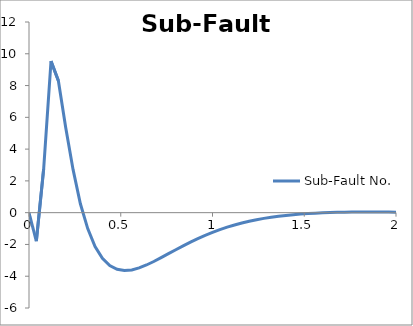
| Category | Sub-Fault No. |
|---|---|
| 0.0 | 0 |
| 0.04 | -1.797 |
| 0.08 | 2.771 |
| 0.12 | 9.537 |
| 0.16 | 8.306 |
| 0.2 | 5.354 |
| 0.24 | 2.724 |
| 0.28 | 0.559 |
| 0.32 | -1.001 |
| 0.36 | -2.128 |
| 0.4 | -2.865 |
| 0.44 | -3.329 |
| 0.48 | -3.565 |
| 0.52 | -3.646 |
| 0.56 | -3.602 |
| 0.6 | -3.478 |
| 0.64 | -3.293 |
| 0.68 | -3.073 |
| 0.72 | -2.831 |
| 0.76 | -2.582 |
| 0.8 | -2.33 |
| 0.84 | -2.087 |
| 0.88 | -1.853 |
| 0.92 | -1.633 |
| 0.96 | -1.428 |
| 1.0 | -1.24 |
| 1.04 | -1.068 |
| 1.08 | -0.913 |
| 1.12 | -0.774 |
| 1.16 | -0.65 |
| 1.2 | -0.541 |
| 1.24 | -0.444 |
| 1.28 | -0.36 |
| 1.32 | -0.287 |
| 1.36 | -0.225 |
| 1.4 | -0.171 |
| 1.44 | -0.126 |
| 1.48 | -0.088 |
| 1.52 | -0.056 |
| 1.56 | -0.03 |
| 1.6 | -0.01 |
| 1.64 | 0.007 |
| 1.68 | 0.019 |
| 1.72 | 0.028 |
| 1.76 | 0.034 |
| 1.8 | 0.038 |
| 1.84 | 0.04 |
| 1.88 | 0.04 |
| 1.92 | 0.038 |
| 1.96 | 0.035 |
| 2.0 | 0.031 |
| 2.04 | 0.026 |
| 2.08 | 0.021 |
| 2.12 | 0.015 |
| 2.16 | 0.009 |
| 2.2 | 0.002 |
| 2.24 | -0.005 |
| 2.28 | -0.012 |
| 2.32 | -0.019 |
| 2.36 | -0.026 |
| 2.4 | -0.033 |
| 2.44 | -0.04 |
| 2.48 | -0.047 |
| 2.52 | -0.054 |
| 2.56 | -0.06 |
| 2.6 | -0.067 |
| 2.64 | -0.073 |
| 2.68 | -0.079 |
| 2.72 | -0.085 |
| 2.76 | -0.09 |
| 2.8 | -0.096 |
| 2.84 | -0.101 |
| 2.88 | -0.106 |
| 2.92 | -0.11 |
| 2.96 | -0.115 |
| 3.0 | -0.119 |
| 3.04 | -0.124 |
| 3.08 | -0.128 |
| 3.12 | -0.131 |
| 3.16 | -0.135 |
| 3.2 | -0.138 |
| 3.24 | -0.142 |
| 3.28 | -0.145 |
| 3.32 | -0.148 |
| 3.36 | -0.151 |
| 3.4 | -0.153 |
| 3.44 | -0.156 |
| 3.48 | -0.158 |
| 3.52 | -0.161 |
| 3.56 | -0.163 |
| 3.6 | -0.165 |
| 3.64 | -0.167 |
| 3.68 | -0.169 |
| 3.72 | -0.171 |
| 3.76 | -0.172 |
| 3.8 | -0.174 |
| 3.84 | -0.175 |
| 3.88 | -0.177 |
| 3.92 | -0.178 |
| 3.96 | -0.18 |
| 4.0 | -0.181 |
| 4.04 | -0.182 |
| 4.08 | -0.183 |
| 4.12 | -0.184 |
| 4.16 | -0.185 |
| 4.2 | -0.186 |
| 4.24 | -0.187 |
| 4.28 | -0.188 |
| 4.32 | -0.188 |
| 4.36 | -0.189 |
| 4.4 | -0.19 |
| 4.44 | -0.191 |
| 4.48 | -0.191 |
| 4.52 | -0.192 |
| 4.56 | -0.192 |
| 4.6 | -0.193 |
| 4.64 | -0.193 |
| 4.68 | -0.194 |
| 4.72 | -0.194 |
| 4.76 | -0.194 |
| 4.8 | -0.194 |
| 4.84 | -0.194 |
| 4.88 | -0.194 |
| 4.92 | -0.194 |
| 4.96 | -0.194 |
| 5.0 | -0.194 |
| 5.04 | -0.194 |
| 5.08 | -0.194 |
| 5.12 | -0.194 |
| 5.16 | -0.194 |
| 5.2 | -0.194 |
| 5.24 | -0.194 |
| 5.28 | -0.194 |
| 5.32 | -0.194 |
| 5.36 | -0.194 |
| 5.4 | -0.194 |
| 5.44 | -0.194 |
| 5.48 | -0.194 |
| 5.52 | -0.194 |
| 5.56 | -0.194 |
| 5.6 | -0.194 |
| 5.64 | -0.194 |
| 5.68 | -0.194 |
| 5.72 | -0.194 |
| 5.76 | -0.194 |
| 5.8 | -0.194 |
| 5.84 | -0.194 |
| 5.88 | -0.194 |
| 5.92 | -0.194 |
| 5.96 | -0.194 |
| 6.0 | -0.194 |
| 6.04 | -0.194 |
| 6.08 | -0.194 |
| 6.12 | -0.194 |
| 6.16 | -0.194 |
| 6.2 | -0.194 |
| 6.24 | -0.194 |
| 6.28 | -0.194 |
| 6.32 | -0.194 |
| 6.36 | -0.194 |
| 6.4 | -0.194 |
| 6.44 | -0.194 |
| 6.48 | -0.194 |
| 6.52 | -0.194 |
| 6.56 | -0.194 |
| 6.6 | -0.194 |
| 6.64 | -0.194 |
| 6.68 | -0.194 |
| 6.72 | -0.194 |
| 6.76 | -0.194 |
| 6.8 | -0.194 |
| 6.84 | -0.194 |
| 6.88 | -0.194 |
| 6.92 | -0.194 |
| 6.96 | -0.194 |
| 7.0 | -0.194 |
| 7.04 | -0.194 |
| 7.08 | -0.194 |
| 7.12 | -0.194 |
| 7.16 | -0.194 |
| 7.2 | -0.194 |
| 7.24 | -0.194 |
| 7.28 | -0.194 |
| 7.32 | -0.194 |
| 7.36 | -0.194 |
| 7.4 | -0.194 |
| 7.44 | -0.194 |
| 7.48 | -0.194 |
| 7.52 | -0.194 |
| 7.56 | -0.194 |
| 7.6 | -0.194 |
| 7.64 | -0.194 |
| 7.68 | -0.194 |
| 7.72 | -0.194 |
| 7.76 | -0.194 |
| 7.8 | -0.194 |
| 7.84 | -0.194 |
| 7.88 | -0.194 |
| 7.92 | -0.194 |
| 7.96 | -0.194 |
| 8.0 | -0.194 |
| 8.04 | -0.194 |
| 8.08 | -0.194 |
| 8.12 | -0.194 |
| 8.16 | -0.194 |
| 8.2 | -0.194 |
| 8.24 | -0.194 |
| 8.28 | -0.194 |
| 8.32 | -0.194 |
| 8.36 | -0.194 |
| 8.4 | -0.194 |
| 8.44 | -0.194 |
| 8.48 | -0.194 |
| 8.52 | -0.194 |
| 8.56 | -0.194 |
| 8.6 | -0.194 |
| 8.64 | -0.194 |
| 8.68 | -0.194 |
| 8.72 | -0.194 |
| 8.76 | -0.194 |
| 8.8 | -0.194 |
| 8.84 | -0.194 |
| 8.88 | -0.194 |
| 8.92 | -0.194 |
| 8.96 | -0.194 |
| 9.0 | -0.194 |
| 9.04 | -0.194 |
| 9.08 | -0.194 |
| 9.12 | -0.194 |
| 9.16 | -0.194 |
| 9.2 | -0.194 |
| 9.24 | -0.194 |
| 9.28 | -0.194 |
| 9.32 | -0.194 |
| 9.36 | -0.194 |
| 9.4 | -0.194 |
| 9.44 | -0.194 |
| 9.48 | -0.194 |
| 9.52 | -0.194 |
| 9.56 | -0.194 |
| 9.6 | -0.194 |
| 9.64 | -0.194 |
| 9.68 | -0.194 |
| 9.72 | -0.194 |
| 9.76 | -0.194 |
| 9.8 | -0.194 |
| 9.84 | -0.194 |
| 9.88 | -0.194 |
| 9.92 | -0.194 |
| 9.96 | -0.194 |
| 10.0 | -0.194 |
| 10.04 | -0.194 |
| 10.08 | -0.194 |
| 10.12 | -0.194 |
| 10.16 | -0.194 |
| 10.2 | -0.194 |
| 10.24 | -0.194 |
| 10.28 | -0.194 |
| 10.32 | -0.194 |
| 10.36 | -0.194 |
| 10.4 | -0.194 |
| 10.44 | -0.194 |
| 10.48 | -0.194 |
| 10.52 | -0.194 |
| 10.56 | -0.194 |
| 10.6 | -0.194 |
| 10.64 | -0.194 |
| 10.68 | -0.194 |
| 10.72 | -0.194 |
| 10.76 | -0.194 |
| 10.8 | -0.194 |
| 10.84 | -0.194 |
| 10.88 | -0.194 |
| 10.92 | -0.194 |
| 10.96 | -0.194 |
| 11.0 | -0.194 |
| 11.04 | -0.194 |
| 11.08 | -0.194 |
| 11.12 | -0.194 |
| 11.16 | -0.194 |
| 11.2 | -0.194 |
| 11.24 | -0.194 |
| 11.28 | -0.194 |
| 11.32 | -0.194 |
| 11.36 | -0.194 |
| 11.4 | -0.194 |
| 11.44 | -0.194 |
| 11.48 | -0.194 |
| 11.52 | -0.194 |
| 11.56 | -0.194 |
| 11.6 | -0.194 |
| 11.64 | -0.194 |
| 11.68 | -0.194 |
| 11.72 | -0.194 |
| 11.76 | -0.194 |
| 11.8 | -0.194 |
| 11.84 | -0.194 |
| 11.88 | -0.194 |
| 11.92 | -0.194 |
| 11.96 | -0.194 |
| 12.0 | -0.194 |
| 12.04 | -0.194 |
| 12.08 | -0.194 |
| 12.12 | -0.194 |
| 12.16 | -0.194 |
| 12.2 | -0.194 |
| 12.24 | -0.194 |
| 12.28 | -0.194 |
| 12.32 | -0.194 |
| 12.36 | -0.194 |
| 12.4 | -0.194 |
| 12.44 | -0.194 |
| 12.48 | -0.194 |
| 12.52 | -0.194 |
| 12.56 | -0.194 |
| 12.6 | -0.194 |
| 12.64 | -0.194 |
| 12.68 | -0.194 |
| 12.72 | -0.194 |
| 12.76 | -0.194 |
| 12.8 | -0.194 |
| 12.84 | -0.194 |
| 12.88 | -0.194 |
| 12.92 | -0.194 |
| 12.96 | -0.194 |
| 13.0 | -0.194 |
| 13.04 | -0.194 |
| 13.08 | -0.194 |
| 13.12 | -0.194 |
| 13.16 | -0.194 |
| 13.2 | -0.194 |
| 13.24 | -0.194 |
| 13.28 | -0.194 |
| 13.32 | -0.194 |
| 13.36 | -0.194 |
| 13.4 | -0.194 |
| 13.44 | -0.194 |
| 13.48 | -0.194 |
| 13.52 | -0.194 |
| 13.56 | -0.194 |
| 13.6 | -0.194 |
| 13.64 | -0.194 |
| 13.68 | -0.194 |
| 13.72 | -0.194 |
| 13.76 | -0.194 |
| 13.8 | -0.194 |
| 13.84 | -0.194 |
| 13.88 | -0.194 |
| 13.92 | -0.194 |
| 13.96 | -0.194 |
| 14.0 | -0.194 |
| 14.04 | -0.194 |
| 14.08 | -0.194 |
| 14.12 | -0.194 |
| 14.16 | -0.194 |
| 14.2 | -0.194 |
| 14.24 | -0.194 |
| 14.28 | -0.194 |
| 14.32 | -0.194 |
| 14.36 | -0.194 |
| 14.4 | -0.194 |
| 14.44 | -0.194 |
| 14.48 | -0.194 |
| 14.52 | -0.194 |
| 14.56 | -0.194 |
| 14.6 | -0.194 |
| 14.64 | -0.194 |
| 14.68 | -0.194 |
| 14.72 | -0.194 |
| 14.76 | -0.194 |
| 14.8 | -0.194 |
| 14.84 | -0.194 |
| 14.88 | -0.194 |
| 14.92 | -0.194 |
| 14.96 | -0.194 |
| 15.0 | -0.194 |
| 15.04 | -0.194 |
| 15.08 | -0.194 |
| 15.12 | -0.194 |
| 15.16 | -0.194 |
| 15.2 | -0.194 |
| 15.24 | -0.194 |
| 15.28 | -0.194 |
| 15.32 | -0.194 |
| 15.36 | -0.194 |
| 15.4 | -0.194 |
| 15.44 | -0.194 |
| 15.48 | -0.194 |
| 15.52 | -0.194 |
| 15.56 | -0.194 |
| 15.6 | -0.194 |
| 15.64 | -0.194 |
| 15.68 | -0.194 |
| 15.72 | -0.194 |
| 15.76 | -0.194 |
| 15.8 | -0.194 |
| 15.84 | -0.194 |
| 15.88 | -0.194 |
| 15.92 | -0.194 |
| 15.96 | -0.194 |
| 16.0 | -0.194 |
| 16.04 | -0.194 |
| 16.08 | -0.194 |
| 16.12 | -0.194 |
| 16.16 | -0.194 |
| 16.2 | -0.194 |
| 16.24 | -0.194 |
| 16.28 | -0.194 |
| 16.32 | -0.194 |
| 16.36 | -0.194 |
| 16.4 | -0.194 |
| 16.44 | -0.194 |
| 16.48 | -0.194 |
| 16.52 | -0.194 |
| 16.56 | -0.194 |
| 16.6 | -0.194 |
| 16.64 | -0.194 |
| 16.68 | -0.194 |
| 16.72 | -0.194 |
| 16.76 | -0.194 |
| 16.8 | -0.194 |
| 16.84 | -0.194 |
| 16.88 | -0.194 |
| 16.92 | -0.194 |
| 16.96 | -0.194 |
| 17.0 | -0.194 |
| 17.04 | -0.194 |
| 17.08 | -0.194 |
| 17.12 | -0.194 |
| 17.16 | -0.194 |
| 17.2 | -0.194 |
| 17.24 | -0.194 |
| 17.28 | -0.194 |
| 17.32 | -0.194 |
| 17.36 | -0.194 |
| 17.4 | -0.194 |
| 17.44 | -0.194 |
| 17.48 | -0.194 |
| 17.52 | -0.194 |
| 17.56 | -0.194 |
| 17.6 | -0.194 |
| 17.64 | -0.194 |
| 17.68 | -0.194 |
| 17.72 | -0.194 |
| 17.76 | -0.194 |
| 17.8 | -0.194 |
| 17.84 | -0.194 |
| 17.88 | -0.194 |
| 17.92 | -0.194 |
| 17.96 | -0.194 |
| 18.0 | -0.194 |
| 18.04 | -0.194 |
| 18.08 | -0.194 |
| 18.12 | -0.194 |
| 18.16 | -0.194 |
| 18.2 | -0.194 |
| 18.24 | -0.194 |
| 18.28 | -0.194 |
| 18.32 | -0.194 |
| 18.36 | -0.194 |
| 18.4 | -0.194 |
| 18.44 | -0.194 |
| 18.48 | -0.194 |
| 18.52 | -0.194 |
| 18.56 | -0.194 |
| 18.6 | -0.194 |
| 18.64 | -0.194 |
| 18.68 | -0.194 |
| 18.72 | -0.194 |
| 18.76 | -0.194 |
| 18.8 | -0.194 |
| 18.84 | -0.194 |
| 18.88 | -0.194 |
| 18.92 | -0.194 |
| 18.96 | -0.194 |
| 19.0 | -0.194 |
| 19.04 | -0.194 |
| 19.08 | -0.194 |
| 19.12 | -0.194 |
| 19.16 | -0.194 |
| 19.2 | -0.194 |
| 19.24 | -0.194 |
| 19.28 | -0.194 |
| 19.32 | -0.194 |
| 19.36 | -0.194 |
| 19.4 | -0.194 |
| 19.44 | -0.194 |
| 19.48 | -0.194 |
| 19.52 | -0.194 |
| 19.56 | -0.194 |
| 19.6 | -0.194 |
| 19.64 | -0.194 |
| 19.68 | -0.194 |
| 19.72 | -0.194 |
| 19.76 | -0.194 |
| 19.8 | -0.194 |
| 19.84 | -0.194 |
| 19.88 | -0.194 |
| 19.92 | -0.194 |
| 19.96 | -0.194 |
| 20.0 | -0.194 |
| 20.04 | -0.194 |
| 20.08 | -0.194 |
| 20.12 | -0.194 |
| 20.16 | -0.194 |
| 20.2 | -0.194 |
| 20.24 | -0.194 |
| 20.28 | -0.194 |
| 20.32 | -0.194 |
| 20.36 | -0.194 |
| 20.4 | -0.194 |
| 20.44 | -0.194 |
| 20.48 | -0.194 |
| 20.52 | -0.194 |
| 20.56 | -0.194 |
| 20.6 | -0.194 |
| 20.64 | -0.194 |
| 20.68 | -0.194 |
| 20.72 | -0.194 |
| 20.76 | -0.194 |
| 20.8 | -0.194 |
| 20.84 | -0.194 |
| 20.88 | -0.194 |
| 20.92 | -0.194 |
| 20.96 | -0.194 |
| 21.0 | -0.194 |
| 21.04 | -0.194 |
| 21.08 | -0.194 |
| 21.12 | -0.194 |
| 21.16 | -0.194 |
| 21.2 | -0.194 |
| 21.24 | -0.194 |
| 21.28 | -0.194 |
| 21.32 | -0.194 |
| 21.36 | -0.194 |
| 21.4 | -0.194 |
| 21.44 | -0.194 |
| 21.48 | -0.194 |
| 21.52 | -0.194 |
| 21.56 | -0.194 |
| 21.6 | -0.194 |
| 21.64 | -0.194 |
| 21.68 | -0.194 |
| 21.72 | -0.194 |
| 21.76 | -0.194 |
| 21.8 | -0.194 |
| 21.84 | -0.194 |
| 21.88 | -0.194 |
| 21.92 | -0.194 |
| 21.96 | -0.194 |
| 22.0 | -0.194 |
| 22.04 | -0.194 |
| 22.08 | -0.194 |
| 22.12 | -0.194 |
| 22.16 | -0.194 |
| 22.2 | -0.194 |
| 22.24 | -0.194 |
| 22.28 | -0.194 |
| 22.32 | -0.194 |
| 22.36 | -0.194 |
| 22.4 | -0.194 |
| 22.44 | -0.194 |
| 22.48 | -0.194 |
| 22.52 | -0.194 |
| 22.56 | -0.194 |
| 22.6 | -0.194 |
| 22.64 | -0.194 |
| 22.68 | -0.194 |
| 22.72 | -0.194 |
| 22.76 | -0.194 |
| 22.8 | -0.194 |
| 22.84 | -0.194 |
| 22.88 | -0.194 |
| 22.92 | -0.194 |
| 22.96 | -0.194 |
| 23.0 | -0.194 |
| 23.04 | -0.194 |
| 23.08 | -0.194 |
| 23.12 | -0.194 |
| 23.16 | -0.194 |
| 23.2 | -0.194 |
| 23.24 | -0.194 |
| 23.28 | -0.194 |
| 23.32 | -0.194 |
| 23.36 | -0.194 |
| 23.4 | -0.194 |
| 23.44 | -0.194 |
| 23.48 | -0.194 |
| 23.52 | -0.194 |
| 23.56 | -0.194 |
| 23.6 | -0.194 |
| 23.64 | -0.194 |
| 23.68 | -0.194 |
| 23.72 | -0.194 |
| 23.76 | -0.194 |
| 23.8 | -0.194 |
| 23.84 | -0.194 |
| 23.88 | -0.194 |
| 23.92 | -0.194 |
| 23.96 | -0.194 |
| 24.0 | -0.194 |
| 24.04 | -0.194 |
| 24.08 | -0.194 |
| 24.12 | -0.194 |
| 24.16 | -0.194 |
| 24.2 | -0.194 |
| 24.24 | -0.194 |
| 24.28 | -0.194 |
| 24.32 | -0.194 |
| 24.36 | -0.194 |
| 24.4 | -0.194 |
| 24.44 | -0.194 |
| 24.48 | -0.194 |
| 24.52 | -0.194 |
| 24.56 | -0.194 |
| 24.6 | -0.194 |
| 24.64 | -0.194 |
| 24.68 | -0.194 |
| 24.72 | -0.194 |
| 24.76 | -0.194 |
| 24.8 | -0.194 |
| 24.84 | -0.194 |
| 24.88 | -0.194 |
| 24.92 | -0.194 |
| 24.96 | -0.194 |
| 25.0 | -0.194 |
| 25.04 | -0.194 |
| 25.08 | -0.194 |
| 25.12 | -0.194 |
| 25.16 | -0.194 |
| 25.2 | -0.194 |
| 25.24 | -0.194 |
| 25.28 | -0.194 |
| 25.32 | -0.194 |
| 25.36 | -0.194 |
| 25.4 | -0.194 |
| 25.44 | -0.194 |
| 25.48 | -0.194 |
| 25.52 | -0.194 |
| 25.56 | -0.194 |
| 25.6 | -0.194 |
| 25.64 | -0.194 |
| 25.68 | -0.194 |
| 25.72 | -0.194 |
| 25.76 | -0.194 |
| 25.8 | -0.194 |
| 25.84 | -0.194 |
| 25.88 | -0.194 |
| 25.92 | -0.194 |
| 25.96 | -0.194 |
| 26.0 | -0.194 |
| 26.04 | -0.194 |
| 26.08 | -0.194 |
| 26.12 | -0.194 |
| 26.16 | -0.194 |
| 26.2 | -0.194 |
| 26.24 | -0.194 |
| 26.28 | -0.194 |
| 26.32 | -0.194 |
| 26.36 | -0.194 |
| 26.4 | -0.194 |
| 26.44 | -0.194 |
| 26.48 | -0.194 |
| 26.52 | -0.194 |
| 26.56 | -0.194 |
| 26.6 | -0.194 |
| 26.64 | -0.194 |
| 26.68 | -0.194 |
| 26.72 | -0.194 |
| 26.76 | -0.194 |
| 26.8 | -0.194 |
| 26.84 | -0.194 |
| 26.88 | -0.194 |
| 26.92 | -0.194 |
| 26.96 | -0.194 |
| 27.0 | -0.194 |
| 27.04 | -0.194 |
| 27.08 | -0.194 |
| 27.12 | -0.194 |
| 27.16 | -0.194 |
| 27.2 | -0.194 |
| 27.24 | -0.194 |
| 27.28 | -0.194 |
| 27.32 | -0.194 |
| 27.36 | -0.194 |
| 27.4 | -0.194 |
| 27.44 | -0.194 |
| 27.48 | -0.194 |
| 27.52 | -0.194 |
| 27.56 | -0.194 |
| 27.6 | -0.194 |
| 27.64 | -0.194 |
| 27.68 | -0.194 |
| 27.72 | -0.194 |
| 27.76 | -0.194 |
| 27.8 | -0.194 |
| 27.84 | -0.194 |
| 27.88 | -0.194 |
| 27.92 | -0.194 |
| 27.96 | -0.194 |
| 28.0 | -0.194 |
| 28.04 | -0.194 |
| 28.08 | -0.194 |
| 28.12 | -0.194 |
| 28.16 | -0.194 |
| 28.2 | -0.194 |
| 28.24 | -0.194 |
| 28.28 | -0.194 |
| 28.32 | -0.194 |
| 28.36 | -0.194 |
| 28.4 | -0.194 |
| 28.44 | -0.194 |
| 28.48 | -0.194 |
| 28.52 | -0.194 |
| 28.56 | -0.194 |
| 28.6 | -0.194 |
| 28.64 | -0.194 |
| 28.68 | -0.194 |
| 28.72 | -0.194 |
| 28.76 | -0.194 |
| 28.8 | -0.194 |
| 28.84 | -0.194 |
| 28.88 | -0.194 |
| 28.92 | -0.194 |
| 28.96 | -0.194 |
| 29.0 | -0.194 |
| 29.04 | -0.194 |
| 29.08 | -0.194 |
| 29.12 | -0.194 |
| 29.16 | -0.194 |
| 29.2 | -0.194 |
| 29.24 | -0.194 |
| 29.28 | -0.194 |
| 29.32 | -0.194 |
| 29.36 | -0.194 |
| 29.4 | -0.194 |
| 29.44 | -0.194 |
| 29.48 | -0.194 |
| 29.52 | -0.194 |
| 29.56 | -0.194 |
| 29.6 | -0.194 |
| 29.64 | -0.194 |
| 29.68 | -0.194 |
| 29.72 | -0.194 |
| 29.76 | -0.194 |
| 29.8 | -0.194 |
| 29.84 | -0.194 |
| 29.88 | -0.194 |
| 29.92 | -0.194 |
| 29.96 | -0.194 |
| 30.0 | -0.194 |
| 30.04 | -0.194 |
| 30.08 | -0.194 |
| 30.12 | -0.194 |
| 30.16 | -0.194 |
| 30.2 | -0.194 |
| 30.24 | -0.194 |
| 30.28 | -0.194 |
| 30.32 | -0.194 |
| 30.36 | -0.194 |
| 30.4 | -0.194 |
| 30.44 | -0.194 |
| 30.48 | -0.194 |
| 30.52 | -0.194 |
| 30.56 | -0.194 |
| 30.6 | -0.194 |
| 30.64 | -0.194 |
| 30.68 | -0.194 |
| 30.72 | -0.194 |
| 30.76 | -0.194 |
| 30.8 | -0.194 |
| 30.84 | -0.194 |
| 30.88 | -0.194 |
| 30.92 | -0.194 |
| 30.96 | -0.194 |
| 31.0 | -0.194 |
| 31.04 | -0.194 |
| 31.08 | -0.194 |
| 31.12 | -0.194 |
| 31.16 | -0.194 |
| 31.2 | -0.194 |
| 31.24 | -0.194 |
| 31.28 | -0.194 |
| 31.32 | -0.194 |
| 31.36 | -0.194 |
| 31.4 | -0.194 |
| 31.44 | -0.194 |
| 31.48 | -0.194 |
| 31.52 | -0.194 |
| 31.56 | -0.194 |
| 31.6 | -0.194 |
| 31.64 | -0.194 |
| 31.68 | -0.194 |
| 31.72 | -0.194 |
| 31.76 | -0.194 |
| 31.8 | -0.194 |
| 31.84 | -0.194 |
| 31.88 | -0.194 |
| 31.92 | -0.194 |
| 31.96 | -0.194 |
| 32.0 | -0.194 |
| 32.04 | -0.194 |
| 32.08 | -0.194 |
| 32.12 | -0.194 |
| 32.16 | -0.194 |
| 32.2 | -0.194 |
| 32.24 | -0.194 |
| 32.28 | -0.194 |
| 32.32 | -0.194 |
| 32.36 | -0.194 |
| 32.4 | -0.194 |
| 32.44 | -0.194 |
| 32.48 | -0.194 |
| 32.52 | -0.194 |
| 32.56 | -0.194 |
| 32.6 | -0.194 |
| 32.64 | -0.194 |
| 32.68 | -0.194 |
| 32.72 | -0.194 |
| 32.76 | -0.194 |
| 32.8 | -0.194 |
| 32.84 | -0.194 |
| 32.88 | -0.194 |
| 32.92 | -0.194 |
| 32.96 | -0.194 |
| 33.0 | -0.194 |
| 33.04 | -0.194 |
| 33.08 | -0.194 |
| 33.12 | -0.194 |
| 33.16 | -0.194 |
| 33.2 | -0.194 |
| 33.24 | -0.194 |
| 33.28 | -0.194 |
| 33.32 | -0.194 |
| 33.36 | -0.194 |
| 33.4 | -0.194 |
| 33.44 | -0.194 |
| 33.48 | -0.194 |
| 33.52 | -0.194 |
| 33.56 | -0.194 |
| 33.6 | -0.194 |
| 33.64 | -0.194 |
| 33.68 | -0.194 |
| 33.72 | -0.194 |
| 33.76 | -0.194 |
| 33.8 | -0.194 |
| 33.84 | -0.194 |
| 33.88 | -0.194 |
| 33.92 | -0.194 |
| 33.96 | -0.194 |
| 34.0 | -0.194 |
| 34.04 | -0.194 |
| 34.08 | -0.194 |
| 34.12 | -0.194 |
| 34.16 | -0.194 |
| 34.2 | -0.194 |
| 34.24 | -0.194 |
| 34.28 | -0.194 |
| 34.32 | -0.194 |
| 34.36 | -0.194 |
| 34.4 | -0.194 |
| 34.44 | -0.194 |
| 34.48 | -0.194 |
| 34.52 | -0.194 |
| 34.56 | -0.194 |
| 34.6 | -0.194 |
| 34.64 | -0.194 |
| 34.68 | -0.194 |
| 34.72 | -0.194 |
| 34.76 | -0.194 |
| 34.8 | -0.194 |
| 34.84 | -0.194 |
| 34.88 | -0.194 |
| 34.92 | -0.194 |
| 34.96 | -0.194 |
| 35.0 | -0.194 |
| 35.04 | -0.194 |
| 35.08 | -0.194 |
| 35.12 | -0.194 |
| 35.16 | -0.194 |
| 35.2 | -0.194 |
| 35.24 | -0.194 |
| 35.28 | -0.194 |
| 35.32 | -0.194 |
| 35.36 | -0.194 |
| 35.4 | -0.194 |
| 35.44 | -0.194 |
| 35.48 | -0.194 |
| 35.52 | -0.194 |
| 35.56 | -0.194 |
| 35.6 | -0.194 |
| 35.64 | -0.194 |
| 35.68 | -0.194 |
| 35.72 | -0.194 |
| 35.76 | -0.194 |
| 35.8 | -0.194 |
| 35.84 | -0.194 |
| 35.88 | -0.194 |
| 35.92 | -0.194 |
| 35.96 | -0.194 |
| 36.0 | -0.194 |
| 36.04 | -0.194 |
| 36.08 | -0.194 |
| 36.12 | -0.194 |
| 36.16 | -0.194 |
| 36.2 | -0.194 |
| 36.24 | -0.194 |
| 36.28 | -0.194 |
| 36.32 | -0.194 |
| 36.36 | -0.194 |
| 36.4 | -0.194 |
| 36.44 | -0.194 |
| 36.48 | -0.194 |
| 36.52 | -0.194 |
| 36.56 | -0.194 |
| 36.6 | -0.194 |
| 36.64 | -0.194 |
| 36.68 | -0.194 |
| 36.72 | -0.194 |
| 36.76 | -0.194 |
| 36.8 | -0.194 |
| 36.84 | -0.194 |
| 36.88 | -0.194 |
| 36.92 | -0.194 |
| 36.96 | -0.194 |
| 37.0 | -0.194 |
| 37.04 | -0.194 |
| 37.08 | -0.194 |
| 37.12 | -0.194 |
| 37.16 | -0.194 |
| 37.2 | -0.194 |
| 37.24 | -0.194 |
| 37.28 | -0.194 |
| 37.32 | -0.194 |
| 37.36 | -0.194 |
| 37.4 | -0.194 |
| 37.44 | -0.194 |
| 37.48 | -0.194 |
| 37.52 | -0.194 |
| 37.56 | -0.194 |
| 37.6 | -0.194 |
| 37.64 | -0.194 |
| 37.68 | -0.194 |
| 37.72 | -0.194 |
| 37.76 | -0.194 |
| 37.8 | -0.194 |
| 37.84 | -0.194 |
| 37.88 | -0.194 |
| 37.92 | -0.194 |
| 37.96 | -0.194 |
| 38.0 | -0.194 |
| 38.04 | -0.194 |
| 38.08 | -0.194 |
| 38.12 | -0.194 |
| 38.16 | -0.194 |
| 38.2 | -0.194 |
| 38.24 | -0.194 |
| 38.28 | -0.194 |
| 38.32 | -0.194 |
| 38.36 | -0.194 |
| 38.4 | -0.194 |
| 38.44 | -0.194 |
| 38.48 | -0.194 |
| 38.52 | -0.194 |
| 38.56 | -0.194 |
| 38.6 | -0.194 |
| 38.64 | -0.194 |
| 38.68 | -0.194 |
| 38.72 | -0.194 |
| 38.76 | -0.194 |
| 38.8 | -0.194 |
| 38.84 | -0.194 |
| 38.88 | -0.194 |
| 38.92 | -0.194 |
| 38.96 | -0.194 |
| 39.0 | -0.194 |
| 39.04 | -0.194 |
| 39.08 | -0.194 |
| 39.12 | -0.194 |
| 39.16 | -0.194 |
| 39.2 | -0.194 |
| 39.24 | -0.194 |
| 39.28 | -0.194 |
| 39.32 | -0.194 |
| 39.36 | -0.194 |
| 39.4 | -0.194 |
| 39.44 | -0.194 |
| 39.48 | -0.194 |
| 39.52 | -0.194 |
| 39.56 | -0.194 |
| 39.6 | -0.194 |
| 39.64 | -0.194 |
| 39.68 | -0.194 |
| 39.72 | -0.194 |
| 39.76 | -0.194 |
| 39.8 | -0.194 |
| 39.84 | -0.194 |
| 39.88 | -0.194 |
| 39.92 | -0.194 |
| 39.96 | -0.194 |
| 40.0 | -0.194 |
| 40.04 | -0.194 |
| 40.08 | -0.194 |
| 40.12 | -0.194 |
| 40.16 | -0.194 |
| 40.2 | -0.194 |
| 40.24 | -0.194 |
| 40.28 | -0.194 |
| 40.32 | -0.194 |
| 40.36 | -0.194 |
| 40.4 | -0.194 |
| 40.44 | -0.194 |
| 40.48 | -0.194 |
| 40.52 | -0.194 |
| 40.56 | -0.194 |
| 40.6 | -0.194 |
| 40.64 | -0.194 |
| 40.68 | -0.194 |
| 40.72 | -0.194 |
| 40.76 | -0.194 |
| 40.8 | -0.194 |
| 40.84 | -0.194 |
| 40.88 | -0.194 |
| 40.92 | -0.194 |
| 40.96 | -0.194 |
| 41.0 | -0.194 |
| 41.04 | -0.194 |
| 41.08 | -0.194 |
| 41.12 | -0.194 |
| 41.16 | -0.194 |
| 41.2 | -0.194 |
| 41.24 | -0.194 |
| 41.28 | -0.194 |
| 41.32 | -0.194 |
| 41.36 | -0.194 |
| 41.4 | -0.194 |
| 41.44 | -0.194 |
| 41.48 | -0.194 |
| 41.52 | -0.194 |
| 41.56 | -0.194 |
| 41.6 | -0.194 |
| 41.64 | -0.194 |
| 41.68 | -0.194 |
| 41.72 | -0.194 |
| 41.76 | -0.194 |
| 41.8 | -0.194 |
| 41.84 | -0.194 |
| 41.88 | -0.194 |
| 41.92 | -0.194 |
| 41.96 | -0.194 |
| 42.0 | -0.194 |
| 42.04 | -0.194 |
| 42.08 | -0.194 |
| 42.12 | -0.194 |
| 42.16 | -0.194 |
| 42.2 | -0.194 |
| 42.24 | -0.194 |
| 42.28 | -0.194 |
| 42.32 | -0.194 |
| 42.36 | -0.194 |
| 42.4 | -0.194 |
| 42.44 | -0.194 |
| 42.48 | -0.194 |
| 42.52 | -0.194 |
| 42.56 | -0.194 |
| 42.6 | -0.194 |
| 42.64 | -0.194 |
| 42.68 | -0.194 |
| 42.72 | -0.194 |
| 42.76 | -0.194 |
| 42.8 | -0.194 |
| 42.84 | -0.194 |
| 42.88 | -0.194 |
| 42.92 | -0.194 |
| 42.96 | -0.194 |
| 43.0 | -0.194 |
| 43.04 | -0.194 |
| 43.08 | -0.194 |
| 43.12 | -0.194 |
| 43.16 | -0.194 |
| 43.2 | -0.194 |
| 43.24 | -0.194 |
| 43.28 | -0.194 |
| 43.32 | -0.194 |
| 43.36 | -0.194 |
| 43.4 | -0.194 |
| 43.44 | -0.194 |
| 43.48 | -0.194 |
| 43.52 | -0.194 |
| 43.56 | -0.194 |
| 43.6 | -0.194 |
| 43.64 | -0.194 |
| 43.68 | -0.194 |
| 43.72 | -0.194 |
| 43.76 | -0.194 |
| 43.8 | -0.194 |
| 43.84 | -0.194 |
| 43.88 | -0.194 |
| 43.92 | -0.194 |
| 43.96 | -0.194 |
| 44.0 | -0.194 |
| 44.04 | -0.194 |
| 44.08 | -0.194 |
| 44.12 | -0.194 |
| 44.16 | -0.194 |
| 44.2 | -0.194 |
| 44.24 | -0.194 |
| 44.28 | -0.194 |
| 44.32 | -0.194 |
| 44.36 | -0.194 |
| 44.4 | -0.194 |
| 44.44 | -0.194 |
| 44.48 | -0.194 |
| 44.52 | -0.194 |
| 44.56 | -0.194 |
| 44.6 | -0.194 |
| 44.64 | -0.194 |
| 44.68 | -0.194 |
| 44.72 | -0.194 |
| 44.76 | -0.194 |
| 44.8 | -0.194 |
| 44.84 | -0.194 |
| 44.88 | -0.194 |
| 44.92 | -0.194 |
| 44.96 | -0.194 |
| 45.0 | -0.194 |
| 45.04 | -0.194 |
| 45.08 | -0.194 |
| 45.12 | -0.194 |
| 45.16 | -0.194 |
| 45.2 | -0.194 |
| 45.24 | -0.194 |
| 45.28 | -0.194 |
| 45.32 | -0.194 |
| 45.36 | -0.194 |
| 45.4 | -0.194 |
| 45.44 | -0.194 |
| 45.48 | -0.194 |
| 45.52 | -0.194 |
| 45.56 | -0.194 |
| 45.6 | -0.194 |
| 45.64 | -0.194 |
| 45.68 | -0.194 |
| 45.72 | -0.194 |
| 45.76 | -0.194 |
| 45.8 | -0.194 |
| 45.84 | -0.194 |
| 45.88 | -0.194 |
| 45.92 | -0.194 |
| 45.96 | -0.194 |
| 46.0 | -0.194 |
| 46.04 | -0.194 |
| 46.08 | -0.194 |
| 46.12 | -0.194 |
| 46.16 | -0.194 |
| 46.2 | -0.194 |
| 46.24 | -0.194 |
| 46.28 | -0.194 |
| 46.32 | -0.194 |
| 46.36 | -0.194 |
| 46.4 | -0.194 |
| 46.44 | -0.194 |
| 46.48 | -0.194 |
| 46.52 | -0.194 |
| 46.56 | -0.194 |
| 46.6 | -0.194 |
| 46.64 | -0.194 |
| 46.68 | -0.194 |
| 46.72 | -0.194 |
| 46.76 | -0.194 |
| 46.8 | -0.194 |
| 46.84 | -0.194 |
| 46.88 | -0.194 |
| 46.92 | -0.194 |
| 46.96 | -0.194 |
| 47.0 | -0.194 |
| 47.04 | -0.194 |
| 47.08 | -0.194 |
| 47.12 | -0.194 |
| 47.16 | -0.194 |
| 47.2 | -0.194 |
| 47.24 | -0.194 |
| 47.28 | -0.194 |
| 47.32 | -0.194 |
| 47.36 | -0.194 |
| 47.4 | -0.194 |
| 47.44 | -0.194 |
| 47.48 | -0.194 |
| 47.52 | -0.194 |
| 47.56 | -0.194 |
| 47.6 | -0.194 |
| 47.64 | -0.194 |
| 47.68 | -0.194 |
| 47.72 | -0.194 |
| 47.76 | -0.194 |
| 47.8 | -0.194 |
| 47.84 | -0.194 |
| 47.88 | -0.194 |
| 47.92 | -0.194 |
| 47.96 | -0.194 |
| 48.0 | -0.194 |
| 48.04 | -0.194 |
| 48.08 | -0.194 |
| 48.12 | -0.194 |
| 48.16 | -0.194 |
| 48.2 | -0.194 |
| 48.24 | -0.194 |
| 48.28 | -0.194 |
| 48.32 | -0.194 |
| 48.36 | -0.194 |
| 48.4 | -0.194 |
| 48.44 | -0.194 |
| 48.48 | -0.194 |
| 48.52 | -0.194 |
| 48.56 | -0.194 |
| 48.6 | -0.194 |
| 48.64 | -0.194 |
| 48.68 | -0.194 |
| 48.72 | -0.194 |
| 48.76 | -0.194 |
| 48.8 | -0.194 |
| 48.84 | -0.194 |
| 48.88 | -0.194 |
| 48.92 | -0.194 |
| 48.96 | -0.194 |
| 49.0 | -0.194 |
| 49.04 | -0.194 |
| 49.08 | -0.194 |
| 49.12 | -0.194 |
| 49.16 | -0.194 |
| 49.2 | -0.194 |
| 49.24 | -0.194 |
| 49.28 | -0.194 |
| 49.32 | -0.194 |
| 49.36 | -0.194 |
| 49.4 | -0.194 |
| 49.44 | -0.194 |
| 49.48 | -0.194 |
| 49.52 | -0.194 |
| 49.56 | -0.194 |
| 49.6 | -0.194 |
| 49.64 | -0.194 |
| 49.68 | -0.194 |
| 49.72 | -0.194 |
| 49.76 | -0.194 |
| 49.8 | -0.194 |
| 49.84 | -0.194 |
| 49.88 | -0.194 |
| 49.92 | -0.194 |
| 49.96 | -0.194 |
| 50.0 | -0.194 |
| 50.04 | -0.194 |
| 50.08 | -0.194 |
| 50.12 | -0.194 |
| 50.16 | -0.194 |
| 50.2 | -0.194 |
| 50.24 | -0.194 |
| 50.28 | -0.194 |
| 50.32 | -0.194 |
| 50.36 | -0.194 |
| 50.4 | -0.194 |
| 50.44 | -0.194 |
| 50.48 | -0.194 |
| 50.52 | -0.194 |
| 50.56 | -0.194 |
| 50.6 | -0.194 |
| 50.64 | -0.194 |
| 50.68 | -0.194 |
| 50.72 | -0.194 |
| 50.76 | -0.194 |
| 50.8 | -0.194 |
| 50.84 | -0.194 |
| 50.88 | -0.194 |
| 50.92 | -0.194 |
| 50.96 | -0.194 |
| 51.0 | -0.194 |
| 51.04 | -0.194 |
| 51.08 | -0.194 |
| 51.12 | -0.194 |
| 51.16 | -0.194 |
| 51.2 | -0.194 |
| 51.24 | -0.194 |
| 51.28 | -0.194 |
| 51.32 | -0.194 |
| 51.36 | -0.194 |
| 51.4 | -0.194 |
| 51.44 | -0.194 |
| 51.48 | -0.194 |
| 51.52 | -0.194 |
| 51.56 | -0.194 |
| 51.6 | -0.194 |
| 51.64 | -0.194 |
| 51.68 | -0.194 |
| 51.72 | -0.194 |
| 51.76 | -0.194 |
| 51.8 | -0.194 |
| 51.84 | -0.194 |
| 51.88 | -0.194 |
| 51.92 | -0.194 |
| 51.96 | -0.194 |
| 52.0 | -0.194 |
| 52.04 | -0.194 |
| 52.08 | -0.194 |
| 52.12 | -0.194 |
| 52.16 | -0.194 |
| 52.2 | -0.194 |
| 52.24 | -0.194 |
| 52.28 | -0.194 |
| 52.32 | -0.194 |
| 52.36 | -0.194 |
| 52.4 | -0.194 |
| 52.44 | -0.194 |
| 52.48 | -0.194 |
| 52.52 | -0.194 |
| 52.56 | -0.194 |
| 52.6 | -0.194 |
| 52.64 | -0.194 |
| 52.68 | -0.194 |
| 52.72 | -0.194 |
| 52.76 | -0.194 |
| 52.8 | -0.194 |
| 52.84 | -0.194 |
| 52.88 | -0.194 |
| 52.92 | -0.194 |
| 52.96 | -0.194 |
| 53.0 | -0.194 |
| 53.04 | -0.194 |
| 53.08 | -0.194 |
| 53.12 | -0.194 |
| 53.16 | -0.194 |
| 53.2 | -0.194 |
| 53.24 | -0.194 |
| 53.28 | -0.194 |
| 53.32 | -0.194 |
| 53.36 | -0.194 |
| 53.4 | -0.194 |
| 53.44 | -0.194 |
| 53.48 | -0.194 |
| 53.52 | -0.194 |
| 53.56 | -0.194 |
| 53.6 | -0.194 |
| 53.64 | -0.194 |
| 53.68 | -0.194 |
| 53.72 | -0.194 |
| 53.76 | -0.194 |
| 53.8 | -0.194 |
| 53.84 | -0.194 |
| 53.88 | -0.194 |
| 53.92 | -0.194 |
| 53.96 | -0.194 |
| 54.0 | -0.194 |
| 54.04 | -0.194 |
| 54.08 | -0.194 |
| 54.12 | -0.194 |
| 54.16 | -0.194 |
| 54.2 | -0.194 |
| 54.24 | -0.194 |
| 54.28 | -0.194 |
| 54.32 | -0.194 |
| 54.36 | -0.194 |
| 54.4 | -0.194 |
| 54.44 | -0.194 |
| 54.48 | -0.194 |
| 54.52 | -0.194 |
| 54.56 | -0.194 |
| 54.6 | -0.194 |
| 54.64 | -0.194 |
| 54.68 | -0.194 |
| 54.72 | -0.194 |
| 54.76 | -0.194 |
| 54.8 | -0.194 |
| 54.84 | -0.194 |
| 54.88 | -0.194 |
| 54.92 | -0.194 |
| 54.96 | -0.194 |
| 55.0 | -0.194 |
| 55.04 | -0.194 |
| 55.08 | -0.194 |
| 55.12 | -0.194 |
| 55.16 | -0.194 |
| 55.2 | -0.194 |
| 55.24 | -0.194 |
| 55.28 | -0.194 |
| 55.32 | -0.194 |
| 55.36 | -0.194 |
| 55.4 | -0.194 |
| 55.44 | -0.194 |
| 55.48 | -0.194 |
| 55.52 | -0.194 |
| 55.56 | -0.194 |
| 55.6 | -0.194 |
| 55.64 | -0.194 |
| 55.68 | -0.194 |
| 55.72 | -0.194 |
| 55.76 | -0.194 |
| 55.8 | -0.194 |
| 55.84 | -0.194 |
| 55.88 | -0.194 |
| 55.92 | -0.194 |
| 55.96 | -0.194 |
| 56.0 | -0.194 |
| 56.04 | -0.194 |
| 56.08 | -0.194 |
| 56.12 | -0.194 |
| 56.16 | -0.194 |
| 56.2 | -0.194 |
| 56.24 | -0.194 |
| 56.28 | -0.194 |
| 56.32 | -0.194 |
| 56.36 | -0.194 |
| 56.4 | -0.194 |
| 56.44 | -0.194 |
| 56.48 | -0.194 |
| 56.52 | -0.194 |
| 56.56 | -0.194 |
| 56.6 | -0.194 |
| 56.64 | -0.194 |
| 56.68 | -0.194 |
| 56.72 | -0.194 |
| 56.76 | -0.194 |
| 56.8 | -0.194 |
| 56.84 | -0.194 |
| 56.88 | -0.194 |
| 56.92 | -0.194 |
| 56.96 | -0.194 |
| 57.0 | -0.194 |
| 57.04 | -0.194 |
| 57.08 | -0.194 |
| 57.12 | -0.194 |
| 57.16 | -0.194 |
| 57.2 | -0.194 |
| 57.24 | -0.194 |
| 57.28 | -0.194 |
| 57.32 | -0.194 |
| 57.36 | -0.194 |
| 57.4 | -0.194 |
| 57.44 | -0.194 |
| 57.48 | -0.194 |
| 57.52 | -0.194 |
| 57.56 | -0.194 |
| 57.6 | -0.194 |
| 57.64 | -0.194 |
| 57.68 | -0.194 |
| 57.72 | -0.194 |
| 57.76 | -0.194 |
| 57.8 | -0.194 |
| 57.84 | -0.194 |
| 57.88 | -0.194 |
| 57.92 | -0.194 |
| 57.96 | -0.194 |
| 58.0 | -0.194 |
| 58.04 | -0.194 |
| 58.08 | -0.194 |
| 58.12 | -0.194 |
| 58.16 | -0.194 |
| 58.2 | -0.194 |
| 58.24 | -0.194 |
| 58.28 | -0.194 |
| 58.32 | -0.194 |
| 58.36 | -0.194 |
| 58.4 | -0.194 |
| 58.44 | -0.194 |
| 58.48 | -0.194 |
| 58.52 | -0.194 |
| 58.56 | -0.194 |
| 58.6 | -0.194 |
| 58.64 | -0.194 |
| 58.68 | -0.194 |
| 58.72 | -0.194 |
| 58.76 | -0.194 |
| 58.8 | -0.194 |
| 58.84 | -0.194 |
| 58.88 | -0.194 |
| 58.92 | -0.194 |
| 58.96 | -0.194 |
| 59.0 | -0.194 |
| 59.04 | -0.194 |
| 59.08 | -0.194 |
| 59.12 | -0.194 |
| 59.16 | -0.194 |
| 59.2 | -0.194 |
| 59.24 | -0.194 |
| 59.28 | -0.194 |
| 59.32 | -0.194 |
| 59.36 | -0.194 |
| 59.4 | -0.194 |
| 59.44 | -0.194 |
| 59.48 | -0.194 |
| 59.52 | -0.194 |
| 59.56 | -0.194 |
| 59.6 | -0.194 |
| 59.64 | -0.194 |
| 59.68 | -0.194 |
| 59.72 | -0.194 |
| 59.76 | -0.194 |
| 59.8 | -0.194 |
| 59.84 | -0.194 |
| 59.88 | -0.194 |
| 59.92 | -0.194 |
| 59.96 | -0.194 |
| 60.0 | -0.194 |
| 60.04 | -0.194 |
| 60.08 | -0.194 |
| 60.12 | -0.194 |
| 60.16 | -0.194 |
| 60.2 | -0.194 |
| 60.24 | -0.194 |
| 60.28 | -0.194 |
| 60.32 | -0.194 |
| 60.36 | -0.194 |
| 60.4 | -0.194 |
| 60.44 | -0.194 |
| 60.48 | -0.194 |
| 60.52 | -0.194 |
| 60.56 | -0.194 |
| 60.6 | -0.194 |
| 60.64 | -0.194 |
| 60.68 | -0.194 |
| 60.72 | -0.194 |
| 60.76 | -0.194 |
| 60.8 | -0.194 |
| 60.84 | -0.194 |
| 60.88 | -0.194 |
| 60.92 | -0.194 |
| 60.96 | -0.194 |
| 61.0 | -0.194 |
| 61.04 | -0.194 |
| 61.08 | -0.194 |
| 61.12 | -0.194 |
| 61.16 | -0.194 |
| 61.2 | -0.194 |
| 61.24 | -0.194 |
| 61.28 | -0.194 |
| 61.32 | -0.194 |
| 61.36 | -0.194 |
| 61.4 | -0.194 |
| 61.44 | -0.194 |
| 61.48 | -0.194 |
| 61.52 | -0.194 |
| 61.56 | -0.194 |
| 61.6 | -0.194 |
| 61.64 | -0.194 |
| 61.68 | -0.194 |
| 61.72 | -0.194 |
| 61.76 | -0.194 |
| 61.8 | -0.194 |
| 61.84 | -0.194 |
| 61.88 | -0.194 |
| 61.92 | -0.194 |
| 61.96 | -0.194 |
| 62.0 | -0.194 |
| 62.04 | -0.194 |
| 62.08 | -0.194 |
| 62.12 | -0.194 |
| 62.16 | -0.194 |
| 62.2 | -0.194 |
| 62.24 | -0.194 |
| 62.28 | -0.194 |
| 62.32 | -0.194 |
| 62.36 | -0.194 |
| 62.4 | -0.194 |
| 62.44 | -0.194 |
| 62.48 | -0.194 |
| 62.52 | -0.194 |
| 62.56 | -0.194 |
| 62.6 | -0.194 |
| 62.64 | -0.194 |
| 62.68 | -0.194 |
| 62.72 | -0.194 |
| 62.76 | -0.194 |
| 62.8 | -0.194 |
| 62.84 | -0.194 |
| 62.88 | -0.194 |
| 62.92 | -0.194 |
| 62.96 | -0.194 |
| 63.0 | -0.194 |
| 63.04 | -0.194 |
| 63.08 | -0.194 |
| 63.12 | -0.194 |
| 63.16 | -0.194 |
| 63.2 | -0.194 |
| 63.24 | -0.194 |
| 63.28 | -0.194 |
| 63.32 | -0.194 |
| 63.36 | -0.194 |
| 63.4 | -0.194 |
| 63.44 | -0.194 |
| 63.48 | -0.194 |
| 63.52 | -0.194 |
| 63.56 | -0.194 |
| 63.6 | -0.194 |
| 63.64 | -0.194 |
| 63.68 | -0.194 |
| 63.72 | -0.194 |
| 63.76 | -0.194 |
| 63.8 | -0.194 |
| 63.84 | -0.194 |
| 63.88 | -0.194 |
| 63.92 | -0.194 |
| 63.96 | -0.194 |
| 64.0 | -0.194 |
| 64.04 | -0.194 |
| 64.08 | -0.194 |
| 64.12 | -0.194 |
| 64.16 | -0.194 |
| 64.2 | -0.194 |
| 64.24 | -0.194 |
| 64.28 | -0.194 |
| 64.32 | -0.194 |
| 64.36 | -0.194 |
| 64.4 | -0.194 |
| 64.44 | -0.194 |
| 64.48 | -0.194 |
| 64.52 | -0.194 |
| 64.56 | -0.194 |
| 64.6 | -0.194 |
| 64.64 | -0.194 |
| 64.68 | -0.194 |
| 64.72 | -0.194 |
| 64.76 | -0.194 |
| 64.8 | -0.194 |
| 64.84 | -0.194 |
| 64.88 | -0.194 |
| 64.92 | -0.194 |
| 64.96 | -0.194 |
| 65.0 | -0.194 |
| 65.04 | -0.194 |
| 65.08 | -0.194 |
| 65.12 | -0.194 |
| 65.16 | -0.194 |
| 65.2 | -0.194 |
| 65.24 | -0.194 |
| 65.28 | -0.194 |
| 65.32 | -0.194 |
| 65.36 | -0.194 |
| 65.4 | -0.194 |
| 65.44 | -0.194 |
| 65.48 | -0.194 |
| 65.52 | -0.194 |
| 65.56 | -0.194 |
| 65.6 | -0.194 |
| 65.64 | -0.194 |
| 65.68 | -0.194 |
| 65.72 | -0.194 |
| 65.76 | -0.194 |
| 65.8 | -0.194 |
| 65.84 | -0.194 |
| 65.88 | -0.194 |
| 65.92 | -0.194 |
| 65.96 | -0.194 |
| 66.0 | -0.194 |
| 66.04 | -0.194 |
| 66.08 | -0.194 |
| 66.12 | -0.194 |
| 66.16 | -0.194 |
| 66.2 | -0.194 |
| 66.24 | -0.194 |
| 66.28 | -0.194 |
| 66.32 | -0.194 |
| 66.36 | -0.194 |
| 66.4 | -0.194 |
| 66.44 | -0.194 |
| 66.48 | -0.194 |
| 66.52 | -0.194 |
| 66.56 | -0.194 |
| 66.6 | -0.194 |
| 66.64 | -0.194 |
| 66.68 | -0.194 |
| 66.72 | -0.194 |
| 66.76 | -0.194 |
| 66.8 | -0.194 |
| 66.84 | -0.194 |
| 66.88 | -0.194 |
| 66.92 | -0.194 |
| 66.96 | -0.194 |
| 67.0 | -0.194 |
| 67.04 | -0.194 |
| 67.08 | -0.194 |
| 67.12 | -0.194 |
| 67.16 | -0.194 |
| 67.2 | -0.194 |
| 67.24 | -0.194 |
| 67.28 | -0.194 |
| 67.32 | -0.194 |
| 67.36 | -0.194 |
| 67.4 | -0.194 |
| 67.44 | -0.194 |
| 67.48 | -0.194 |
| 67.52 | -0.194 |
| 67.56 | -0.194 |
| 67.6 | -0.194 |
| 67.64 | -0.194 |
| 67.68 | -0.194 |
| 67.72 | -0.194 |
| 67.76 | -0.194 |
| 67.8 | -0.194 |
| 67.84 | -0.194 |
| 67.88 | -0.194 |
| 67.92 | -0.194 |
| 67.96 | -0.194 |
| 68.0 | -0.194 |
| 68.04 | -0.194 |
| 68.08 | -0.194 |
| 68.12 | -0.194 |
| 68.16 | -0.194 |
| 68.2 | -0.194 |
| 68.24 | -0.194 |
| 68.28 | -0.194 |
| 68.32 | -0.194 |
| 68.36 | -0.194 |
| 68.4 | -0.194 |
| 68.44 | -0.194 |
| 68.48 | -0.194 |
| 68.52 | -0.194 |
| 68.56 | -0.194 |
| 68.6 | -0.194 |
| 68.64 | -0.194 |
| 68.68 | -0.194 |
| 68.72 | -0.194 |
| 68.76 | -0.194 |
| 68.8 | -0.194 |
| 68.84 | -0.194 |
| 68.88 | -0.194 |
| 68.92 | -0.194 |
| 68.96 | -0.194 |
| 69.0 | -0.194 |
| 69.04 | -0.194 |
| 69.08 | -0.194 |
| 69.12 | -0.194 |
| 69.16 | -0.194 |
| 69.2 | -0.194 |
| 69.24 | -0.194 |
| 69.28 | -0.194 |
| 69.32 | -0.194 |
| 69.36 | -0.194 |
| 69.4 | -0.194 |
| 69.44 | -0.194 |
| 69.48 | -0.194 |
| 69.52 | -0.194 |
| 69.56 | -0.194 |
| 69.6 | -0.194 |
| 69.64 | -0.194 |
| 69.68 | -0.194 |
| 69.72 | -0.194 |
| 69.76 | -0.194 |
| 69.8 | -0.194 |
| 69.84 | -0.194 |
| 69.88 | -0.194 |
| 69.92 | -0.194 |
| 69.96 | -0.194 |
| 70.0 | -0.194 |
| 70.04 | -0.194 |
| 70.08 | -0.194 |
| 70.12 | -0.194 |
| 70.16 | -0.194 |
| 70.2 | -0.194 |
| 70.24 | -0.194 |
| 70.28 | -0.194 |
| 70.32 | -0.194 |
| 70.36 | -0.194 |
| 70.4 | -0.194 |
| 70.44 | -0.194 |
| 70.48 | -0.194 |
| 70.52 | -0.194 |
| 70.56 | -0.194 |
| 70.6 | -0.194 |
| 70.64 | -0.194 |
| 70.68 | -0.194 |
| 70.72 | -0.194 |
| 70.76 | -0.194 |
| 70.8 | -0.194 |
| 70.84 | -0.194 |
| 70.88 | -0.194 |
| 70.92 | -0.194 |
| 70.96 | -0.194 |
| 71.0 | -0.194 |
| 71.04 | -0.194 |
| 71.08 | -0.194 |
| 71.12 | -0.194 |
| 71.16 | -0.194 |
| 71.2 | -0.194 |
| 71.24 | -0.194 |
| 71.28 | -0.194 |
| 71.32 | -0.194 |
| 71.36 | -0.194 |
| 71.4 | -0.194 |
| 71.44 | -0.194 |
| 71.48 | -0.194 |
| 71.52 | -0.194 |
| 71.56 | -0.194 |
| 71.6 | -0.194 |
| 71.64 | -0.194 |
| 71.68 | -0.194 |
| 71.72 | -0.194 |
| 71.76 | -0.194 |
| 71.8 | -0.194 |
| 71.84 | -0.194 |
| 71.88 | -0.194 |
| 71.92 | -0.194 |
| 71.96 | -0.194 |
| 72.0 | -0.194 |
| 72.04 | -0.194 |
| 72.08 | -0.194 |
| 72.12 | -0.194 |
| 72.16 | -0.194 |
| 72.2 | -0.194 |
| 72.24 | -0.194 |
| 72.28 | -0.194 |
| 72.32 | -0.194 |
| 72.36 | -0.194 |
| 72.4 | -0.194 |
| 72.44 | -0.194 |
| 72.48 | -0.194 |
| 72.52 | -0.194 |
| 72.56 | -0.194 |
| 72.6 | -0.194 |
| 72.64 | -0.194 |
| 72.68 | -0.194 |
| 72.72 | -0.194 |
| 72.76 | -0.194 |
| 72.8 | -0.194 |
| 72.84 | -0.194 |
| 72.88 | -0.194 |
| 72.92 | -0.194 |
| 72.96 | -0.194 |
| 73.0 | -0.194 |
| 73.04 | -0.194 |
| 73.08 | -0.194 |
| 73.12 | -0.194 |
| 73.16 | -0.194 |
| 73.2 | -0.194 |
| 73.24 | -0.194 |
| 73.28 | -0.194 |
| 73.32 | -0.194 |
| 73.36 | -0.194 |
| 73.4 | -0.194 |
| 73.44 | -0.194 |
| 73.48 | -0.194 |
| 73.52 | -0.194 |
| 73.56 | -0.194 |
| 73.6 | -0.194 |
| 73.64 | -0.194 |
| 73.68 | -0.194 |
| 73.72 | -0.194 |
| 73.76 | -0.194 |
| 73.8 | -0.194 |
| 73.84 | -0.194 |
| 73.88 | -0.194 |
| 73.92 | -0.194 |
| 73.96 | -0.194 |
| 74.0 | -0.194 |
| 74.04 | -0.194 |
| 74.08 | -0.194 |
| 74.12 | -0.194 |
| 74.16 | -0.194 |
| 74.2 | -0.194 |
| 74.24 | -0.194 |
| 74.28 | -0.194 |
| 74.32 | -0.194 |
| 74.36 | -0.194 |
| 74.4 | -0.194 |
| 74.44 | -0.194 |
| 74.48 | -0.194 |
| 74.52 | -0.194 |
| 74.56 | -0.194 |
| 74.6 | -0.194 |
| 74.64 | -0.194 |
| 74.68 | -0.194 |
| 74.72 | -0.194 |
| 74.76 | -0.194 |
| 74.8 | -0.194 |
| 74.84 | -0.194 |
| 74.88 | -0.194 |
| 74.92 | -0.194 |
| 74.96 | -0.194 |
| 75.0 | -0.194 |
| 75.04 | -0.194 |
| 75.08 | -0.194 |
| 75.12 | -0.194 |
| 75.16 | -0.194 |
| 75.2 | -0.194 |
| 75.24 | -0.194 |
| 75.28 | -0.194 |
| 75.32 | -0.194 |
| 75.36 | -0.194 |
| 75.4 | -0.194 |
| 75.44 | -0.194 |
| 75.48 | -0.194 |
| 75.52 | -0.194 |
| 75.56 | -0.194 |
| 75.6 | -0.194 |
| 75.64 | -0.194 |
| 75.68 | -0.194 |
| 75.72 | -0.194 |
| 75.76 | -0.194 |
| 75.8 | -0.194 |
| 75.84 | -0.194 |
| 75.88 | -0.194 |
| 75.92 | -0.194 |
| 75.96 | -0.194 |
| 76.0 | -0.194 |
| 76.04 | -0.194 |
| 76.08 | -0.194 |
| 76.12 | -0.194 |
| 76.16 | -0.194 |
| 76.2 | -0.194 |
| 76.24 | -0.194 |
| 76.28 | -0.194 |
| 76.32 | -0.194 |
| 76.36 | -0.194 |
| 76.4 | -0.194 |
| 76.44 | -0.194 |
| 76.48 | -0.194 |
| 76.52 | -0.194 |
| 76.56 | -0.194 |
| 76.6 | -0.194 |
| 76.64 | -0.194 |
| 76.68 | -0.194 |
| 76.72 | -0.194 |
| 76.76 | -0.194 |
| 76.8 | -0.194 |
| 76.84 | -0.194 |
| 76.88 | -0.194 |
| 76.92 | -0.194 |
| 76.96 | -0.194 |
| 77.0 | -0.194 |
| 77.04 | -0.194 |
| 77.08 | -0.194 |
| 77.12 | -0.194 |
| 77.16 | -0.194 |
| 77.2 | -0.194 |
| 77.24 | -0.194 |
| 77.28 | -0.194 |
| 77.32 | -0.194 |
| 77.36 | -0.194 |
| 77.4 | -0.194 |
| 77.44 | -0.194 |
| 77.48 | -0.194 |
| 77.52 | -0.194 |
| 77.56 | -0.194 |
| 77.6 | -0.194 |
| 77.64 | -0.194 |
| 77.68 | -0.194 |
| 77.72 | -0.194 |
| 77.76 | -0.194 |
| 77.8 | -0.194 |
| 77.84 | -0.194 |
| 77.88 | -0.194 |
| 77.92 | -0.194 |
| 77.96 | -0.194 |
| 78.0 | -0.194 |
| 78.04 | -0.194 |
| 78.08 | -0.194 |
| 78.12 | -0.194 |
| 78.16 | -0.194 |
| 78.2 | -0.194 |
| 78.24 | -0.194 |
| 78.28 | -0.194 |
| 78.32 | -0.194 |
| 78.36 | -0.194 |
| 78.4 | -0.194 |
| 78.44 | -0.194 |
| 78.48 | -0.194 |
| 78.52 | -0.194 |
| 78.56 | -0.194 |
| 78.6 | -0.194 |
| 78.64 | -0.194 |
| 78.68 | -0.194 |
| 78.72 | -0.194 |
| 78.76 | -0.194 |
| 78.8 | -0.194 |
| 78.84 | -0.194 |
| 78.88 | -0.194 |
| 78.92 | -0.194 |
| 78.96 | -0.194 |
| 79.0 | -0.194 |
| 79.04 | -0.194 |
| 79.08 | -0.194 |
| 79.12 | -0.194 |
| 79.16 | -0.194 |
| 79.2 | -0.194 |
| 79.24 | -0.194 |
| 79.28 | -0.194 |
| 79.32 | -0.194 |
| 79.36 | -0.194 |
| 79.4 | -0.194 |
| 79.44 | -0.194 |
| 79.48 | -0.194 |
| 79.52 | -0.194 |
| 79.56 | -0.194 |
| 79.6 | -0.194 |
| 79.64 | -0.194 |
| 79.68 | -0.194 |
| 79.72 | -0.194 |
| 79.76 | -0.194 |
| 79.8 | -0.194 |
| 79.84 | -0.194 |
| 79.88 | -0.194 |
| 79.92 | -0.194 |
| 79.96 | -0.194 |
| 80.0 | -0.194 |
| 80.04 | -0.194 |
| 80.08 | -0.194 |
| 80.12 | -0.194 |
| 80.16 | -0.194 |
| 80.2 | -0.194 |
| 80.24 | -0.194 |
| 80.28 | -0.194 |
| 80.32 | -0.194 |
| 80.36 | -0.194 |
| 80.4 | -0.194 |
| 80.44 | -0.194 |
| 80.48 | -0.194 |
| 80.52 | -0.194 |
| 80.56 | -0.194 |
| 80.6 | -0.194 |
| 80.64 | -0.194 |
| 80.68 | -0.194 |
| 80.72 | -0.194 |
| 80.76 | -0.194 |
| 80.8 | -0.194 |
| 80.84 | -0.194 |
| 80.88 | -0.194 |
| 80.92 | -0.194 |
| 80.96 | -0.194 |
| 81.0 | -0.194 |
| 81.04 | -0.194 |
| 81.08 | -0.194 |
| 81.12 | -0.194 |
| 81.16 | -0.194 |
| 81.2 | -0.194 |
| 81.24 | -0.194 |
| 81.28 | -0.194 |
| 81.32 | -0.194 |
| 81.36 | -0.194 |
| 81.4 | -0.194 |
| 81.44 | -0.194 |
| 81.48 | -0.194 |
| 81.52 | -0.194 |
| 81.56 | -0.194 |
| 81.6 | -0.194 |
| 81.64 | -0.194 |
| 81.68 | -0.194 |
| 81.72 | -0.194 |
| 81.76 | -0.194 |
| 81.8 | -0.194 |
| 81.84 | -0.194 |
| 81.88 | -0.194 |